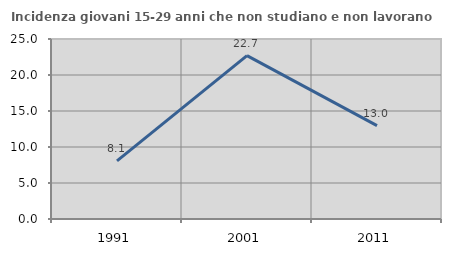
| Category | Incidenza giovani 15-29 anni che non studiano e non lavorano  |
|---|---|
| 1991.0 | 8.07 |
| 2001.0 | 22.699 |
| 2011.0 | 12.977 |